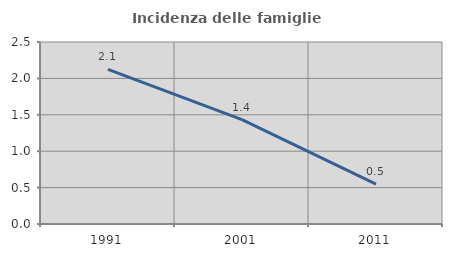
| Category | Incidenza delle famiglie numerose |
|---|---|
| 1991.0 | 2.123 |
| 2001.0 | 1.433 |
| 2011.0 | 0.548 |